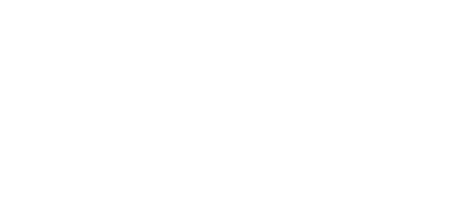
| Category | Series 0 |
|---|---|
| 0 | 0 |
| 1 | 0 |
| 2 | 0 |
| 3 | 0 |
| 4 | 0 |
| 5 | 0 |
| 6 | 0 |
| 7 | 0 |
| 8 | 0 |
| 9 | 0 |
| 10 | 0 |
| 11 | 0 |
| 12 | 0 |